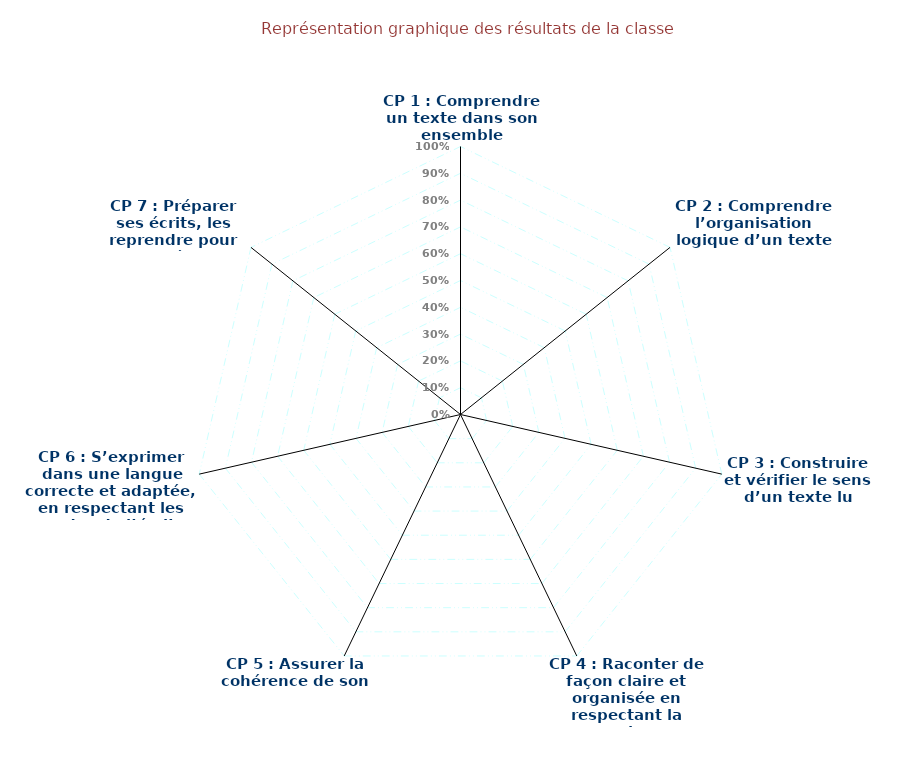
| Category | Évaluations français 5e |
|---|---|
| CP 1 : Comprendre un texte dans son ensemble | 0 |
| CP 2 : Comprendre l’organisation logique d’un texte | 0 |
| CP 3 : Construire et vérifier le sens d’un texte lu | 0 |
| CP 4 : Raconter de façon claire et organisée en respectant la consigne | 0 |
| CP 5 : Assurer la cohérence de son récit | 0 |
| CP 6 : S’exprimer dans une langue correcte et adaptée, en respectant les codes de l’écrit | 0 |
| CP 7 : Préparer ses écrits, les reprendre pour les améliorer | 0 |